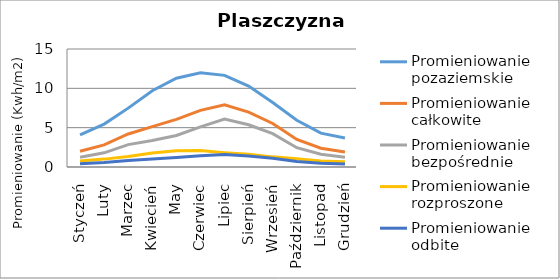
| Category | Promieniowanie pozaziemskie | Promieniowanie całkowite | Promieniowanie bezpośrednie | Promieniowanie rozproszone | Promieniowanie odbite |
|---|---|---|---|---|---|
| Styczeń | 4.099 | 2 | 1.242 | 0.758 | 0.4 |
| Luty | 5.457 | 2.806 | 1.804 | 1.002 | 0.561 |
| Marzec | 7.483 | 4.194 | 2.849 | 1.346 | 0.839 |
| Kwiecień | 9.7 | 5.139 | 3.368 | 1.771 | 1.028 |
| May | 11.288 | 6.056 | 4 | 2.055 | 1.211 |
| Czerwiec | 11.966 | 7.194 | 5.107 | 2.087 | 1.439 |
| Lipiec | 11.647 | 7.917 | 6.104 | 1.813 | 1.583 |
| Sierpień | 10.284 | 6.972 | 5.366 | 1.607 | 1.394 |
| Wrzesień | 8.19 | 5.528 | 4.24 | 1.288 | 1.106 |
| Październik | 5.94 | 3.5 | 2.453 | 1.047 | 0.7 |
| Listopad | 4.3 | 2.389 | 1.613 | 0.776 | 0.478 |
| Grudzień | 3.675 | 1.917 | 1.244 | 0.673 | 0.383 |